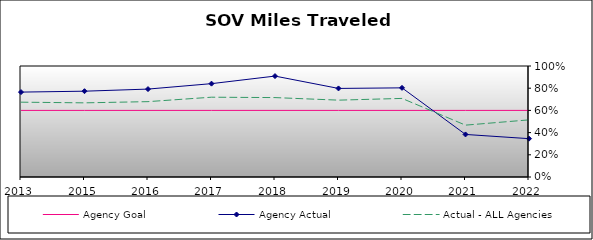
| Category | Agency Goal | Agency Actual | Actual - ALL Agencies |
|---|---|---|---|
| 2013.0 | 0.6 | 0.765 | 0.674 |
| 2015.0 | 0.6 | 0.773 | 0.668 |
| 2016.0 | 0.6 | 0.792 | 0.679 |
| 2017.0 | 0.6 | 0.841 | 0.719 |
| 2018.0 | 0.6 | 0.909 | 0.715 |
| 2019.0 | 0.6 | 0.798 | 0.692 |
| 2020.0 | 0.6 | 0.803 | 0.708 |
| 2021.0 | 0.6 | 0.383 | 0.467 |
| 2022.0 | 0.6 | 0.345 | 0.515 |